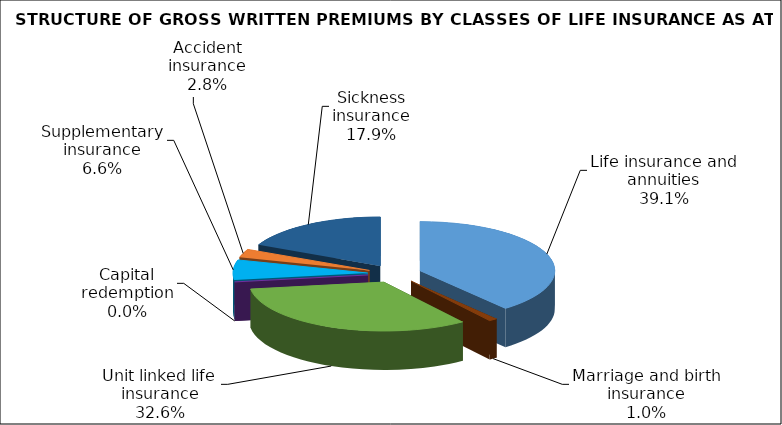
| Category | Series 0 |
|---|---|
| Life insurance and annuities | 209165544.163 |
| Marriage and birth insurance | 5518050.685 |
| Unit linked life insurance | 174800685.496 |
| Capital redemption | 0 |
| Supplementary insurance | 35302371.418 |
| Accident insurance | 14764032.99 |
| Sickness insurance | 96012989.58 |